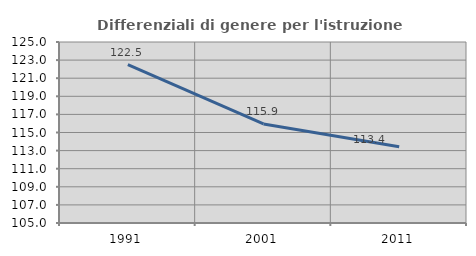
| Category | Differenziali di genere per l'istruzione superiore |
|---|---|
| 1991.0 | 122.506 |
| 2001.0 | 115.947 |
| 2011.0 | 113.43 |